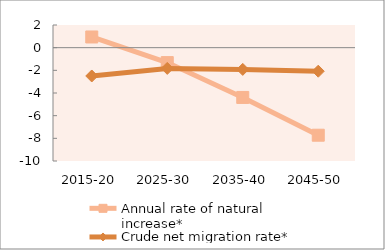
| Category | Annual rate of natural increase* | Crude net migration rate* |
|---|---|---|
| 2015-20 | 0.943 | -2.499 |
| 2025-30 | -1.318 | -1.829 |
| 2035-40 | -4.392 | -1.917 |
| 2045-50 | -7.724 | -2.077 |